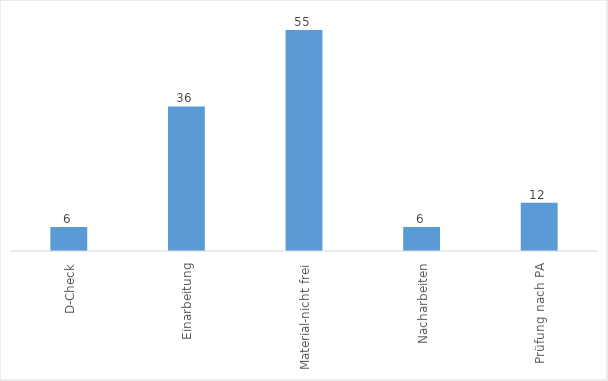
| Category | Series 0 |
|---|---|
| D-Check | 6 |
| Einarbeitung | 36 |
| Material-nicht frei | 55 |
| Nacharbeiten | 6 |
| Prüfung nach PA | 12 |